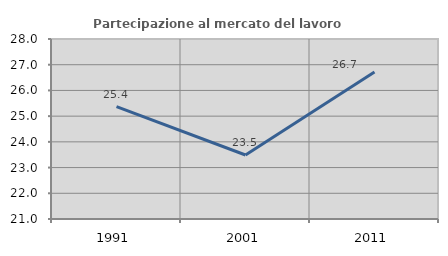
| Category | Partecipazione al mercato del lavoro  femminile |
|---|---|
| 1991.0 | 25.373 |
| 2001.0 | 23.488 |
| 2011.0 | 26.718 |